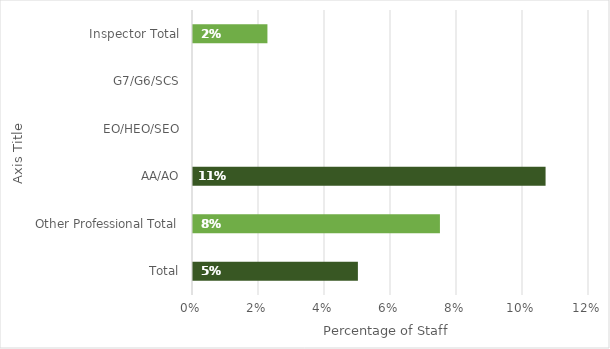
| Category | % BAME |
|---|---|
| Total | 0.05 |
| Other Professional Total | 0.075 |
| AA/AO | 0.107 |
| EO/HEO/SEO | 0 |
| G7/G6/SCS | 0 |
| Inspector Total | 0.023 |